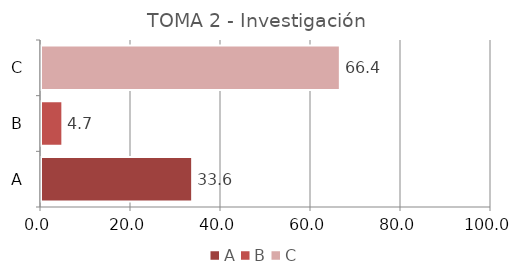
| Category | Series 0 |
|---|---|
| A | 33.59 |
| B | 4.744 |
| C | 66.41 |